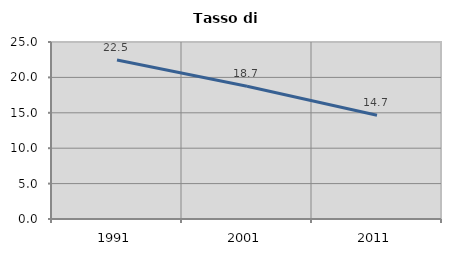
| Category | Tasso di disoccupazione   |
|---|---|
| 1991.0 | 22.462 |
| 2001.0 | 18.745 |
| 2011.0 | 14.657 |